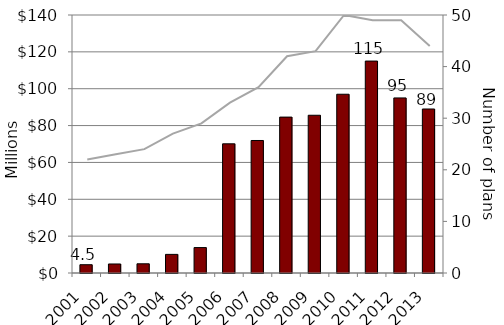
| Category | Dollars (millions) |
|---|---|
| 2001.0 | 4.5 |
| 2002.0 | 4.9 |
| 2003.0 | 5 |
| 2004.0 | 10.1 |
| 2005.0 | 13.8 |
| 2006.0 | 70.1 |
| 2007.0 | 71.9 |
| 2008.0 | 84.6 |
| 2009.0 | 85.6 |
| 2010.0 | 97 |
| 2011.0 | 115 |
| 2012.0 | 95 |
| 2013.0 | 89 |